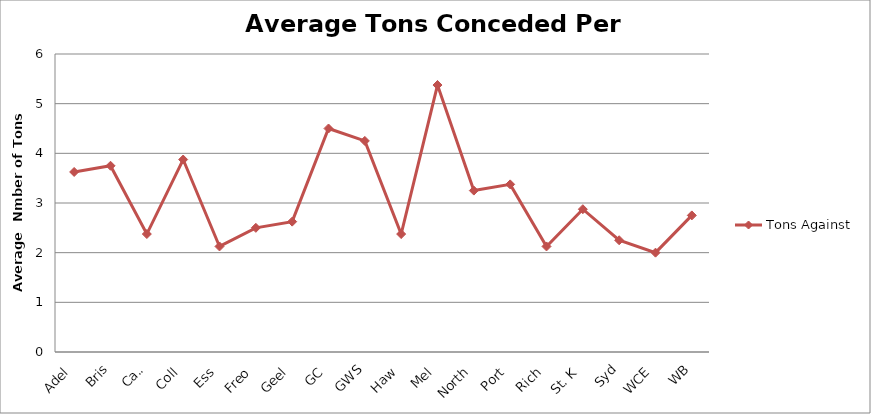
| Category | Tons Against |
|---|---|
| Adel | 3.625 |
| Bris | 3.75 |
| Carl | 2.375 |
| Coll | 3.875 |
| Ess | 2.125 |
| Freo | 2.5 |
| Geel | 2.625 |
| GC | 4.5 |
| GWS | 4.25 |
| Haw | 2.375 |
| Mel | 5.375 |
| North | 3.25 |
| Port | 3.375 |
| Rich | 2.125 |
| St. K | 2.875 |
| Syd | 2.25 |
| WCE | 2 |
| WB | 2.75 |